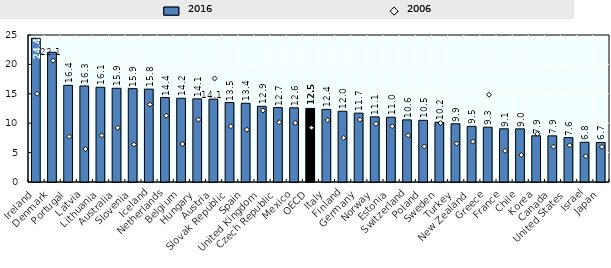
| Category | 2016 |
|---|---|
| Ireland | 24.44 |
| Denmark | 22.06 |
| Portugal | 16.44 |
| Latvia | 16.33 |
| Lithuania | 16.11 |
| Australia | 15.94 |
| Slovenia | 15.88 |
| Iceland | 15.8 |
| Netherlands | 14.36 |
| Belgium | 14.24 |
| Hungary | 14.14 |
| Austria | 14.09 |
| Slovak Republic | 13.51 |
| Spain | 13.39 |
| United Kingdom | 12.87 |
| Czech Republic | 12.66 |
| Mexico | 12.62 |
| OECD | 12.509 |
| Italy | 12.35 |
| Finland | 12.03 |
| Germany | 11.71 |
| Norway | 11.08 |
| Estonia | 11.02 |
| Switzerland | 10.57 |
| Poland | 10.49 |
| Sweden | 10.16 |
| Turkey | 9.9 |
| New Zealand | 9.46 |
| Greece | 9.32 |
| France | 9.05 |
| Chile | 9.04 |
| Korea | 7.86 |
| Canada | 7.85 |
| United States | 7.55 |
| Israel | 6.76 |
| Japan | 6.72 |